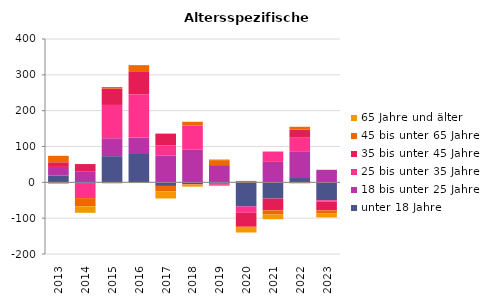
| Category | unter 18 Jahre | 18 bis unter 25 Jahre | 25 bis unter 35 Jahre | 35 bis unter 45 Jahre | 45 bis unter 65 Jahre | 65 Jahre und älter |
|---|---|---|---|---|---|---|
| 2013.0 | 19 | 24 | -1 | 13 | 18 | -3 |
| 2014.0 | -2 | 31 | -42 | 20 | -23 | -18 |
| 2015.0 | 73 | 50 | 93 | 46 | 4 | -3 |
| 2016.0 | 79 | 46 | 121 | 62 | 19 | -2 |
| 2017.0 | -10 | 75 | 28 | 33 | -15 | -20 |
| 2018.0 | -5 | 92 | 66 | -1 | 11 | -6 |
| 2019.0 | -2 | 48 | -4 | -3 | 14 | 2 |
| 2020.0 | -66 | -2 | -17 | -39 | 4 | -16 |
| 2021.0 | -45 | 57 | 29 | -33 | -12 | -13 |
| 2022.0 | 12 | 73 | 41 | 21 | 8 | -3 |
| 2023.0 | -50 | 35 | -4 | -24 | -8 | -12 |